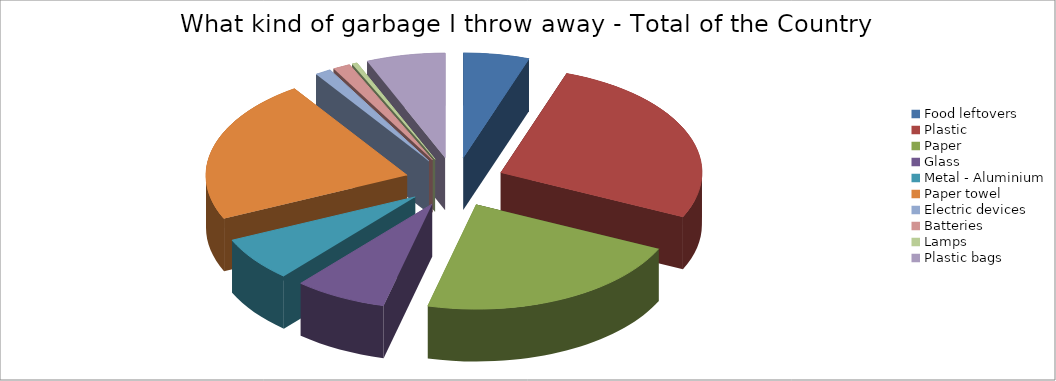
| Category | Food leftovers | What kind of garbage I throw away - Total of the Country |
|---|---|---|
| Food leftovers | 9.348 |  |
| Plastic | 47.048 |  |
| Paper | 38.667 |  |
| Glass | 13.143 |  |
| Metal - Aluminium | 12.143 |  |
| Paper towel | 39.381 |  |
| Electric devices | 2.286 |  |
| Batteries | 2.476 |  |
| Lamps | 0.762 |  |
| Plastic bags | 11.19 |  |